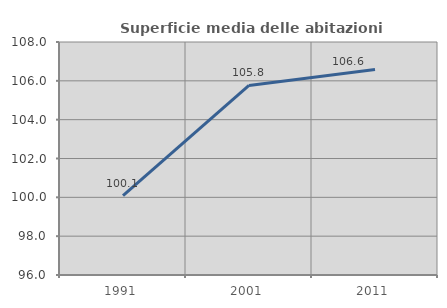
| Category | Superficie media delle abitazioni occupate |
|---|---|
| 1991.0 | 100.083 |
| 2001.0 | 105.765 |
| 2011.0 | 106.586 |